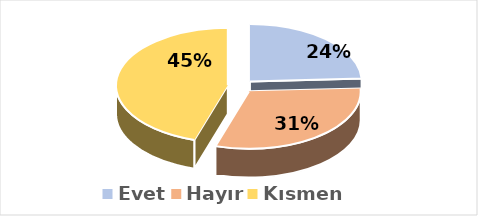
| Category | Evet |
|---|---|
| Evet | 0.242 |
| Hayır | 0.306 |
| Kısmen | 0.452 |